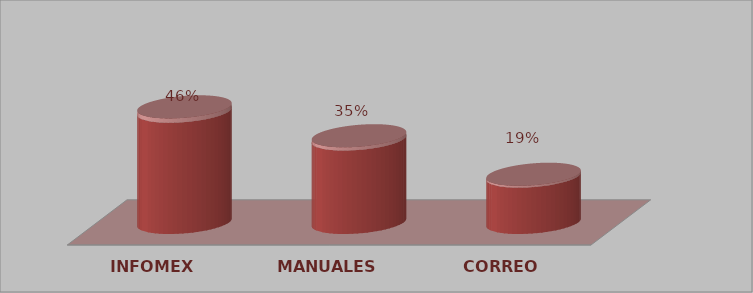
| Category | Series 0 | Series 1 |
|---|---|---|
| INFOMEX | 12 | 0.462 |
| MANUALES | 9 | 0.346 |
| CORREO | 5 | 0.192 |